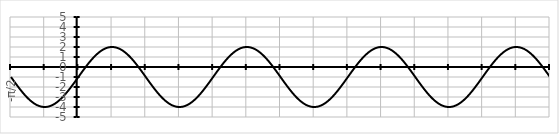
| Category | Series 0 |
|---|---|
| -π/2 | -1 |
|  | -1.105 |
|  | -1.209 |
|  | -1.314 |
|  | -1.418 |
|  | -1.521 |
|  | -1.624 |
|  | -1.726 |
|  | -1.827 |
|  | -1.927 |
|  | -2.026 |
|  | -2.124 |
|  | -2.22 |
|  | -2.315 |
|  | -2.408 |
|  | -2.5 |
|  | -2.59 |
|  | -2.678 |
|  | -2.763 |
|  | -2.847 |
|  | -2.928 |
|  | -3.007 |
|  | -3.084 |
|  | -3.158 |
|  | -3.229 |
|  | -3.298 |
|  | -3.364 |
|  | -3.427 |
|  | -3.487 |
|  | -3.544 |
|  | -3.598 |
|  | -3.649 |
|  | -3.696 |
|  | -3.741 |
|  | -3.782 |
|  | -3.819 |
|  | -3.853 |
|  | -3.884 |
|  | -3.911 |
|  | -3.934 |
|  | -3.954 |
|  | -3.971 |
|  | -3.984 |
|  | -3.993 |
|  | -3.998 |
|   | -4 |
|  | -3.998 |
|  | -3.993 |
|  | -3.984 |
|  | -3.971 |
|  | -3.954 |
|  | -3.934 |
|  | -3.911 |
|  | -3.884 |
|  | -3.853 |
|  | -3.819 |
|  | -3.782 |
|  | -3.741 |
|  | -3.696 |
|  | -3.649 |
|  | -3.598 |
|  | -3.544 |
|  | -3.487 |
|  | -3.427 |
|  | -3.364 |
|  | -3.298 |
|  | -3.229 |
|  | -3.158 |
|  | -3.084 |
|  | -3.007 |
|  | -2.928 |
|  | -2.847 |
|  | -2.763 |
|  | -2.678 |
|  | -2.59 |
|  | -2.5 |
|  | -2.408 |
|  | -2.315 |
|  | -2.22 |
|  | -2.124 |
|  | -2.026 |
|  | -1.927 |
|  | -1.827 |
|  | -1.726 |
|  | -1.624 |
|  | -1.521 |
|  | -1.418 |
|  | -1.314 |
|  | -1.209 |
|  | -1.105 |
| 0 | -1 |
|  | -0.895 |
|  | -0.791 |
|  | -0.686 |
|  | -0.582 |
|  | -0.479 |
|  | -0.376 |
|  | -0.274 |
|  | -0.173 |
|  | -0.073 |
|  | 0.026 |
|  | 0.124 |
|  | 0.22 |
|  | 0.315 |
|  | 0.408 |
|  | 0.5 |
|  | 0.59 |
|  | 0.678 |
|  | 0.763 |
|  | 0.847 |
|  | 0.928 |
|  | 1.007 |
|  | 1.084 |
|  | 1.158 |
|  | 1.229 |
|  | 1.298 |
|  | 1.364 |
|  | 1.427 |
|  | 1.487 |
|  | 1.544 |
|  | 1.598 |
|  | 1.649 |
|  | 1.696 |
|  | 1.741 |
|  | 1.782 |
|  | 1.819 |
|  | 1.853 |
|  | 1.884 |
|  | 1.911 |
|  | 1.934 |
|  | 1.954 |
|  | 1.971 |
|  | 1.984 |
|  | 1.993 |
|  | 1.998 |
|   | 2 |
|  | 1.998 |
|  | 1.993 |
|  | 1.984 |
|  | 1.971 |
|  | 1.954 |
|  | 1.934 |
|  | 1.911 |
|  | 1.884 |
|  | 1.853 |
|  | 1.819 |
|  | 1.782 |
|  | 1.741 |
|  | 1.696 |
|  | 1.649 |
|  | 1.598 |
|  | 1.544 |
|  | 1.487 |
|  | 1.427 |
|  | 1.364 |
|  | 1.298 |
|  | 1.229 |
|  | 1.158 |
|  | 1.084 |
|  | 1.007 |
|  | 0.928 |
|  | 0.847 |
|  | 0.763 |
|  | 0.678 |
|  | 0.59 |
|  | 0.5 |
|  | 0.408 |
|  | 0.315 |
|  | 0.22 |
|  | 0.124 |
|  | 0.026 |
|  | -0.073 |
|  | -0.173 |
|  | -0.274 |
|  | -0.376 |
|  | -0.479 |
|  | -0.582 |
|  | -0.686 |
|  | -0.791 |
|  | -0.895 |
| π/2 | -1 |
|  | -1.105 |
|  | -1.209 |
|  | -1.314 |
|  | -1.418 |
|  | -1.521 |
|  | -1.624 |
|  | -1.726 |
|  | -1.827 |
|  | -1.927 |
|  | -2.026 |
|  | -2.124 |
|  | -2.22 |
|  | -2.315 |
|  | -2.408 |
|  | -2.5 |
|  | -2.59 |
|  | -2.678 |
|  | -2.763 |
|  | -2.847 |
|  | -2.928 |
|  | -3.007 |
|  | -3.084 |
|  | -3.158 |
|  | -3.229 |
|  | -3.298 |
|  | -3.364 |
|  | -3.427 |
|  | -3.487 |
|  | -3.544 |
|  | -3.598 |
|  | -3.649 |
|  | -3.696 |
|  | -3.741 |
|  | -3.782 |
|  | -3.819 |
|  | -3.853 |
|  | -3.884 |
|  | -3.911 |
|  | -3.934 |
|  | -3.954 |
|  | -3.971 |
|  | -3.984 |
|  | -3.993 |
|  | -3.998 |
|   | -4 |
|  | -3.998 |
|  | -3.993 |
|  | -3.984 |
|  | -3.971 |
|  | -3.954 |
|  | -3.934 |
|  | -3.911 |
|  | -3.884 |
|  | -3.853 |
|  | -3.819 |
|  | -3.782 |
|  | -3.741 |
|  | -3.696 |
|  | -3.649 |
|  | -3.598 |
|  | -3.544 |
|  | -3.487 |
|  | -3.427 |
|  | -3.364 |
|  | -3.298 |
|  | -3.229 |
|  | -3.158 |
|  | -3.084 |
|  | -3.007 |
|  | -2.928 |
|  | -2.847 |
|  | -2.763 |
|  | -2.678 |
|  | -2.59 |
|  | -2.5 |
|  | -2.408 |
|  | -2.315 |
|  | -2.22 |
|  | -2.124 |
|  | -2.026 |
|  | -1.927 |
|  | -1.827 |
|  | -1.726 |
|  | -1.624 |
|  | -1.521 |
|  | -1.418 |
|  | -1.314 |
|  | -1.209 |
|  | -1.105 |
| π | -1 |
|  | -0.895 |
|  | -0.791 |
|  | -0.686 |
|  | -0.582 |
|  | -0.479 |
|  | -0.376 |
|  | -0.274 |
|  | -0.173 |
|  | -0.073 |
|  | 0.026 |
|  | 0.124 |
|  | 0.22 |
|  | 0.315 |
|  | 0.408 |
|  | 0.5 |
|  | 0.59 |
|  | 0.678 |
|  | 0.763 |
|  | 0.847 |
|  | 0.928 |
|  | 1.007 |
|  | 1.084 |
|  | 1.158 |
|  | 1.229 |
|  | 1.298 |
|  | 1.364 |
|  | 1.427 |
|  | 1.487 |
|  | 1.544 |
|  | 1.598 |
|  | 1.649 |
|  | 1.696 |
|  | 1.741 |
|  | 1.782 |
|  | 1.819 |
|  | 1.853 |
|  | 1.884 |
|  | 1.911 |
|  | 1.934 |
|  | 1.954 |
|  | 1.971 |
|  | 1.984 |
|  | 1.993 |
|  | 1.998 |
|   | 2 |
|  | 1.998 |
|  | 1.993 |
|  | 1.984 |
|  | 1.971 |
|  | 1.954 |
|  | 1.934 |
|  | 1.911 |
|  | 1.884 |
|  | 1.853 |
|  | 1.819 |
|  | 1.782 |
|  | 1.741 |
|  | 1.696 |
|  | 1.649 |
|  | 1.598 |
|  | 1.544 |
|  | 1.487 |
|  | 1.427 |
|  | 1.364 |
|  | 1.298 |
|  | 1.229 |
|  | 1.158 |
|  | 1.084 |
|  | 1.007 |
|  | 0.928 |
|  | 0.847 |
|  | 0.763 |
|  | 0.678 |
|  | 0.59 |
|  | 0.5 |
|  | 0.408 |
|  | 0.315 |
|  | 0.22 |
|  | 0.124 |
|  | 0.026 |
|  | -0.073 |
|  | -0.173 |
|  | -0.274 |
|  | -0.376 |
|  | -0.479 |
|  | -0.582 |
|  | -0.686 |
|  | -0.791 |
|  | -0.895 |
| 3π/2 | -1 |
|  | -1.105 |
|  | -1.209 |
|  | -1.314 |
|  | -1.418 |
|  | -1.521 |
|  | -1.624 |
|  | -1.726 |
|  | -1.827 |
|  | -1.927 |
|  | -2.026 |
|  | -2.124 |
|  | -2.22 |
|  | -2.315 |
|  | -2.408 |
|  | -2.5 |
|  | -2.59 |
|  | -2.678 |
|  | -2.763 |
|  | -2.847 |
|  | -2.928 |
|  | -3.007 |
|  | -3.084 |
|  | -3.158 |
|  | -3.229 |
|  | -3.298 |
|  | -3.364 |
|  | -3.427 |
|  | -3.487 |
|  | -3.544 |
|  | -3.598 |
|  | -3.649 |
|  | -3.696 |
|  | -3.741 |
|  | -3.782 |
|  | -3.819 |
|  | -3.853 |
|  | -3.884 |
|  | -3.911 |
|  | -3.934 |
|  | -3.954 |
|  | -3.971 |
|  | -3.984 |
|  | -3.993 |
|  | -3.998 |
|   | -4 |
|  | -3.998 |
|  | -3.993 |
|  | -3.984 |
|  | -3.971 |
|  | -3.954 |
|  | -3.934 |
|  | -3.911 |
|  | -3.884 |
|  | -3.853 |
|  | -3.819 |
|  | -3.782 |
|  | -3.741 |
|  | -3.696 |
|  | -3.649 |
|  | -3.598 |
|  | -3.544 |
|  | -3.487 |
|  | -3.427 |
|  | -3.364 |
|  | -3.298 |
|  | -3.229 |
|  | -3.158 |
|  | -3.084 |
|  | -3.007 |
|  | -2.928 |
|  | -2.847 |
|  | -2.763 |
|  | -2.678 |
|  | -2.59 |
|  | -2.5 |
|  | -2.408 |
|  | -2.315 |
|  | -2.22 |
|  | -2.124 |
|  | -2.026 |
|  | -1.927 |
|  | -1.827 |
|  | -1.726 |
|  | -1.624 |
|  | -1.521 |
|  | -1.418 |
|  | -1.314 |
|  | -1.209 |
|  | -1.105 |
| 2π | -1 |
|  | -0.895 |
|  | -0.791 |
|  | -0.686 |
|  | -0.582 |
|  | -0.479 |
|  | -0.376 |
|  | -0.274 |
|  | -0.173 |
|  | -0.073 |
|  | 0.026 |
|  | 0.124 |
|  | 0.22 |
|  | 0.315 |
|  | 0.408 |
|  | 0.5 |
|  | 0.59 |
|  | 0.678 |
|  | 0.763 |
|  | 0.847 |
|  | 0.928 |
|  | 1.007 |
|  | 1.084 |
|  | 1.158 |
|  | 1.229 |
|  | 1.298 |
|  | 1.364 |
|  | 1.427 |
|  | 1.487 |
|  | 1.544 |
|  | 1.598 |
|  | 1.649 |
|  | 1.696 |
|  | 1.741 |
|  | 1.782 |
|  | 1.819 |
|  | 1.853 |
|  | 1.884 |
|  | 1.911 |
|  | 1.934 |
|  | 1.954 |
|  | 1.971 |
|  | 1.984 |
|  | 1.993 |
|  | 1.998 |
|   | 2 |
|  | 1.998 |
|  | 1.993 |
|  | 1.984 |
|  | 1.971 |
|  | 1.954 |
|  | 1.934 |
|  | 1.911 |
|  | 1.884 |
|  | 1.853 |
|  | 1.819 |
|  | 1.782 |
|  | 1.741 |
|  | 1.696 |
|  | 1.649 |
|  | 1.598 |
|  | 1.544 |
|  | 1.487 |
|  | 1.427 |
|  | 1.364 |
|  | 1.298 |
|  | 1.229 |
|  | 1.158 |
|  | 1.084 |
|  | 1.007 |
|  | 0.928 |
|  | 0.847 |
|  | 0.763 |
|  | 0.678 |
|  | 0.59 |
|  | 0.5 |
|  | 0.408 |
|  | 0.315 |
|  | 0.22 |
|  | 0.124 |
|  | 0.026 |
|  | -0.073 |
|  | -0.173 |
|  | -0.274 |
|  | -0.376 |
|  | -0.479 |
|  | -0.582 |
|  | -0.686 |
|  | -0.791 |
|  | -0.895 |
| 5π/2 | -1 |
|  | -1.105 |
|  | -1.209 |
|  | -1.314 |
|  | -1.418 |
|  | -1.521 |
|  | -1.624 |
|  | -1.726 |
|  | -1.827 |
|  | -1.927 |
|  | -2.026 |
|  | -2.124 |
|  | -2.22 |
|  | -2.315 |
|  | -2.408 |
|  | -2.5 |
|  | -2.59 |
|  | -2.678 |
|  | -2.763 |
|  | -2.847 |
|  | -2.928 |
|  | -3.007 |
|  | -3.084 |
|  | -3.158 |
|  | -3.229 |
|  | -3.298 |
|  | -3.364 |
|  | -3.427 |
|  | -3.487 |
|  | -3.544 |
|  | -3.598 |
|  | -3.649 |
|  | -3.696 |
|  | -3.741 |
|  | -3.782 |
|  | -3.819 |
|  | -3.853 |
|  | -3.884 |
|  | -3.911 |
|  | -3.934 |
|  | -3.954 |
|  | -3.971 |
|  | -3.984 |
|  | -3.993 |
|  | -3.998 |
|   | -4 |
|  | -3.998 |
|  | -3.993 |
|  | -3.984 |
|  | -3.971 |
|  | -3.954 |
|  | -3.934 |
|  | -3.911 |
|  | -3.884 |
|  | -3.853 |
|  | -3.819 |
|  | -3.782 |
|  | -3.741 |
|  | -3.696 |
|  | -3.649 |
|  | -3.598 |
|  | -3.544 |
|  | -3.487 |
|  | -3.427 |
|  | -3.364 |
|  | -3.298 |
|  | -3.229 |
|  | -3.158 |
|  | -3.084 |
|  | -3.007 |
|  | -2.928 |
|  | -2.847 |
|  | -2.763 |
|  | -2.678 |
|  | -2.59 |
|  | -2.5 |
|  | -2.408 |
|  | -2.315 |
|  | -2.22 |
|  | -2.124 |
|  | -2.026 |
|  | -1.927 |
|  | -1.827 |
|  | -1.726 |
|  | -1.624 |
|  | -1.521 |
|  | -1.418 |
|  | -1.314 |
|  | -1.209 |
|  | -1.105 |
| 3π | -1 |
|  | -0.895 |
|  | -0.791 |
|  | -0.686 |
|  | -0.582 |
|  | -0.479 |
|  | -0.376 |
|  | -0.274 |
|  | -0.173 |
|  | -0.073 |
|  | 0.026 |
|  | 0.124 |
|  | 0.22 |
|  | 0.315 |
|  | 0.408 |
|  | 0.5 |
|  | 0.59 |
|  | 0.678 |
|  | 0.763 |
|  | 0.847 |
|  | 0.928 |
|  | 1.007 |
|  | 1.084 |
|  | 1.158 |
|  | 1.229 |
|  | 1.298 |
|  | 1.364 |
|  | 1.427 |
|  | 1.487 |
|  | 1.544 |
|  | 1.598 |
|  | 1.649 |
|  | 1.696 |
|  | 1.741 |
|  | 1.782 |
|  | 1.819 |
|  | 1.853 |
|  | 1.884 |
|  | 1.911 |
|  | 1.934 |
|  | 1.954 |
|  | 1.971 |
|  | 1.984 |
|  | 1.993 |
|  | 1.998 |
|   | 2 |
|  | 1.998 |
|  | 1.993 |
|  | 1.984 |
|  | 1.971 |
|  | 1.954 |
|  | 1.934 |
|  | 1.911 |
|  | 1.884 |
|  | 1.853 |
|  | 1.819 |
|  | 1.782 |
|  | 1.741 |
|  | 1.696 |
|  | 1.649 |
|  | 1.598 |
|  | 1.544 |
|  | 1.487 |
|  | 1.427 |
|  | 1.364 |
|  | 1.298 |
|  | 1.229 |
|  | 1.158 |
|  | 1.084 |
|  | 1.007 |
|  | 0.928 |
|  | 0.847 |
|  | 0.763 |
|  | 0.678 |
|  | 0.59 |
|  | 0.5 |
|  | 0.408 |
|  | 0.315 |
|  | 0.22 |
|  | 0.124 |
|  | 0.026 |
|  | -0.073 |
|  | -0.173 |
|  | -0.274 |
|  | -0.376 |
|  | -0.479 |
|  | -0.582 |
|  | -0.686 |
|  | -0.791 |
|  | -0.895 |
| 7π/2 | -1 |